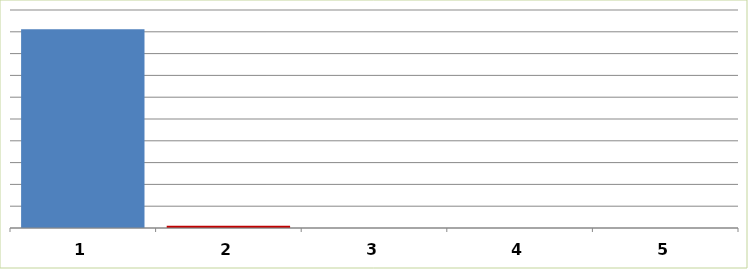
| Category | Series 0 |
|---|---|
| 0 | 1822325 |
| 1 | 20000 |
| 2 | 0 |
| 3 | 0 |
| 4 | 0 |